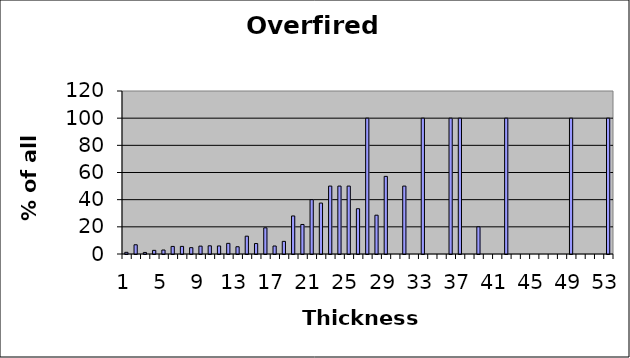
| Category | Series 0 |
|---|---|
| 0 | 1.235 |
| 1 | 6.796 |
| 2 | 1.149 |
| 3 | 2.691 |
| 4 | 2.941 |
| 5 | 5.578 |
| 6 | 5.597 |
| 7 | 4.667 |
| 8 | 5.797 |
| 9 | 6.034 |
| 10 | 5.914 |
| 11 | 7.843 |
| 12 | 5.344 |
| 13 | 13.115 |
| 14 | 7.692 |
| 15 | 19.277 |
| 16 | 5.882 |
| 17 | 9.302 |
| 18 | 28 |
| 19 | 21.739 |
| 20 | 40 |
| 21 | 37.5 |
| 22 | 50 |
| 23 | 50 |
| 24 | 50 |
| 25 | 33.333 |
| 26 | 100 |
| 27 | 28.571 |
| 28 | 57.143 |
| 29 | 0 |
| 30 | 50 |
| 31 | 0 |
| 32 | 100 |
| 33 | 0 |
| 34 | 0 |
| 35 | 100 |
| 36 | 100 |
| 37 | 0 |
| 38 | 20 |
| 39 | 0 |
| 40 | 0 |
| 41 | 100 |
| 42 | 0 |
| 43 | 0 |
| 44 | 0 |
| 45 | 0 |
| 46 | 0 |
| 47 | 0 |
| 48 | 100 |
| 49 | 0 |
| 50 | 0 |
| 51 | 0 |
| 52 | 100 |